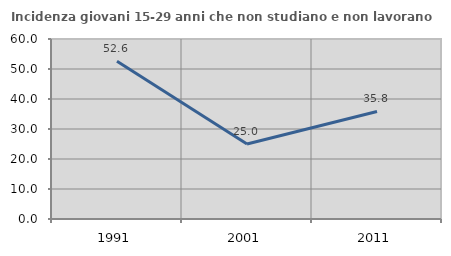
| Category | Incidenza giovani 15-29 anni che non studiano e non lavorano  |
|---|---|
| 1991.0 | 52.562 |
| 2001.0 | 25 |
| 2011.0 | 35.849 |